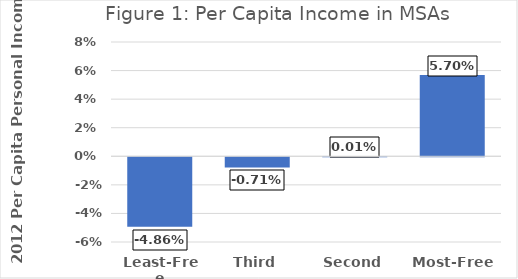
| Category | Series 0 |
|---|---|
| Least-Free | -0.049 |
| Third | -0.007 |
| Second | 0 |
| Most-Free  | 0.057 |